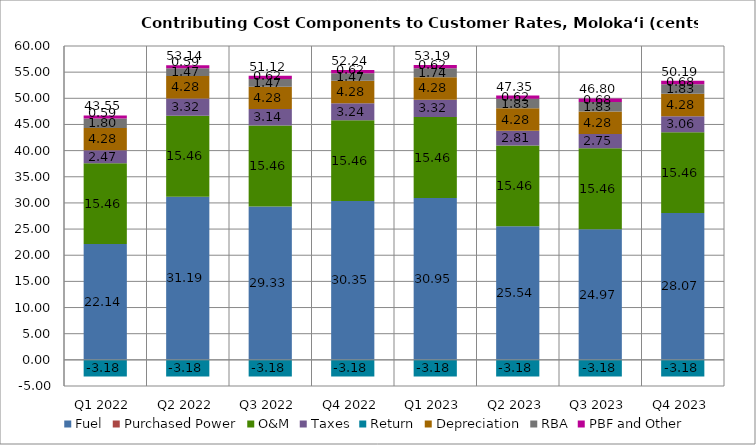
| Category | Fuel | Purchased Power | O&M | Taxes | Return | Depreciation | RBA | PBF and Other | Total |
|---|---|---|---|---|---|---|---|---|---|
| Q1 2022 | 22.137 | 0.004 | 15.459 | 2.468 | -3.181 | 4.279 | 1.796 | 0.587 | 43.549 |
| Q2 2022 | 31.194 | 0.005 | 15.459 | 3.32 | -3.181 | 4.279 | 1.474 | 0.587 | 53.137 |
| Q3 2022 | 29.331 | 0.004 | 15.459 | 3.14 | -3.181 | 4.279 | 1.474 | 0.617 | 51.123 |
| Q4 2022 | 30.353 | 0.003 | 15.459 | 3.24 | -3.181 | 4.279 | 1.474 | 0.617 | 52.244 |
| Q1 2023 | 30.949 | 0.004 | 15.459 | 3.324 | -3.181 | 4.279 | 1.736 | 0.617 | 53.187 |
| Q2 2023 | 25.537 | 0.005 | 15.459 | 2.805 | -3.181 | 4.279 | 1.829 | 0.617 | 47.349 |
| Q3 2023 | 24.974 | 0.004 | 15.459 | 2.754 | -3.181 | 4.279 | 1.829 | 0.681 | 46.799 |
| Q4 2023 | 28.069 | 0.003 | 15.459 | 3.056 | -3.181 | 4.279 | 1.829 | 0.681 | 50.194 |